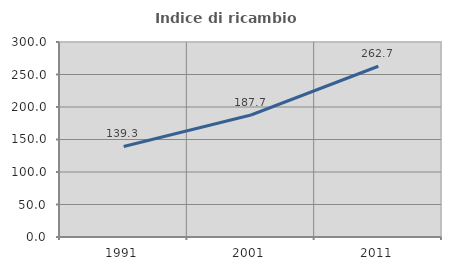
| Category | Indice di ricambio occupazionale  |
|---|---|
| 1991.0 | 139.286 |
| 2001.0 | 187.654 |
| 2011.0 | 262.667 |